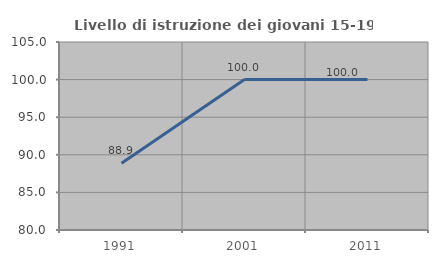
| Category | Livello di istruzione dei giovani 15-19 anni |
|---|---|
| 1991.0 | 88.889 |
| 2001.0 | 100 |
| 2011.0 | 100 |